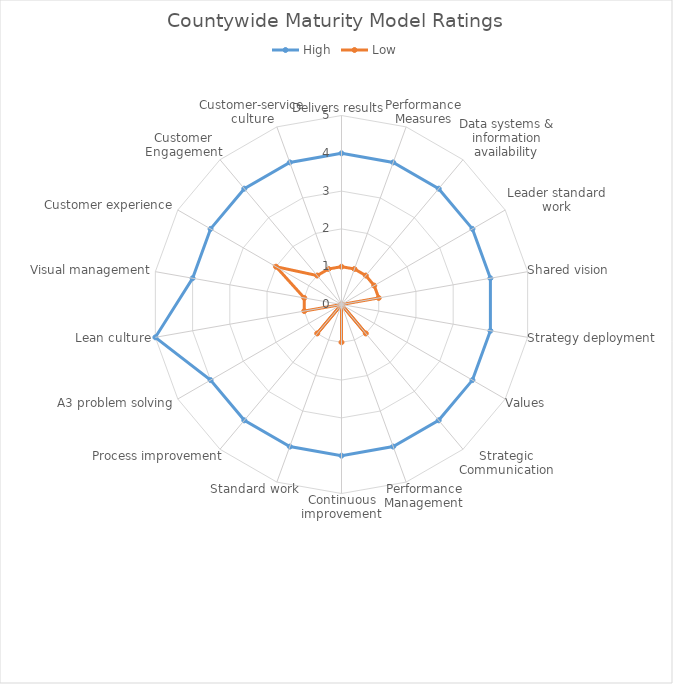
| Category | High | Low |
|---|---|---|
| Delivers results | 4 | 1 |
| Performance Measures | 4 | 1 |
| Data systems & information availability | 4 | 1 |
| Leader standard work | 4 | 1 |
| Shared vision | 4 | 1 |
| Strategy deployment | 4 | 0 |
| Values | 4 | 0 |
| Strategic Communication | 4 | 1 |
| Performance Management | 4 | 0 |
| Continuous improvement | 4 | 1 |
| Standard work | 4 | 0 |
| Process improvement | 4 | 1 |
| A3 problem solving | 4 | 0 |
| Lean culture | 5 | 1 |
| Visual management | 4 | 1 |
| Customer experience | 4 | 2 |
| Customer Engagement | 4 | 1 |
| Customer-service culture | 4 | 1 |